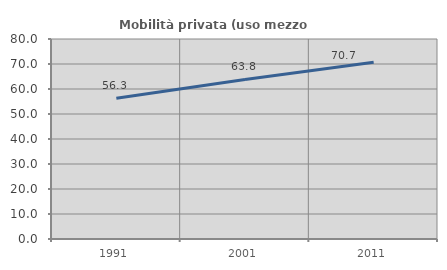
| Category | Mobilità privata (uso mezzo privato) |
|---|---|
| 1991.0 | 56.276 |
| 2001.0 | 63.808 |
| 2011.0 | 70.713 |